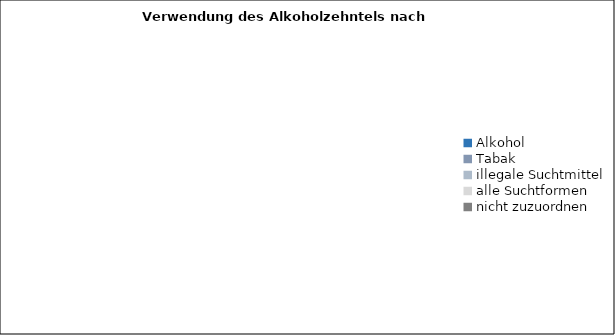
| Category | Series 0 |
|---|---|
| Alkohol | 0 |
| Tabak | 0 |
| illegale Suchtmittel | 0 |
| alle Suchtformen | 0 |
| nicht zuzuordnen | 0 |